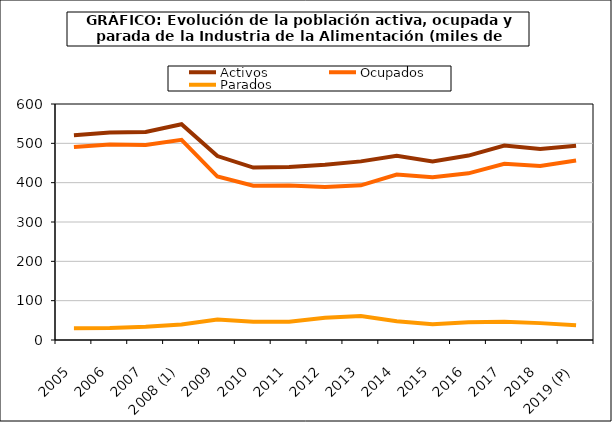
| Category | Activos | Ocupados | Parados |
|---|---|---|---|
| 2005 | 520.85 | 490.7 | 30.15 |
| 2006 | 527.375 | 496.9 | 30.475 |
| 2007 | 529 | 495.6 | 33.4 |
| 2008 (1) | 548.65 | 509 | 39.7 |
| 2009 | 467.6 | 415.6 | 52 |
| 2010 | 438.425 | 392.275 | 46.2 |
| 2011 | 439.6 | 393.1 | 46.5 |
| 2012 | 445.725 | 388.925 | 56.8 |
| 2013 | 454.1 | 393.3 | 60.8 |
| 2014 | 468.5 | 420.7 | 47.8 |
| 2015 | 454.1 | 414 | 40.1 |
| 2016 | 468.925 | 423.675 | 45.25 |
| 2017 | 494.275 | 448.025 | 46.25 |
| 2018 | 485.3 | 442.4 | 42.9 |
| 2019 (P) | 493.6 | 456.1 | 37.5 |